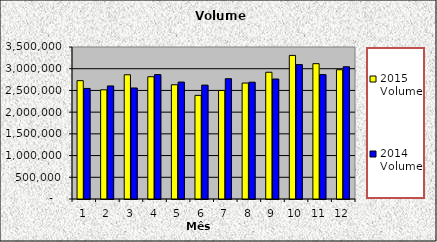
| Category | 2015 Volume | 2014 Volume |
|---|---|---|
| 0 | 2724750 | 2545500 |
| 1 | 2513466.667 | 2602850 |
| 2 | 2860383.333 | 2556116.667 |
| 3 | 2815050 | 2863850 |
| 4 | 2630416.667 | 2692600 |
| 5 | 2386266.667 | 2622166.667 |
| 6 | 2499100 | 2769384 |
| 7 | 2669921 | 2689733.333 |
| 8 | 2918545.8 | 2763139 |
| 9 | 3306499 | 3094300 |
| 10 | 3116101 | 2864083.333 |
| 11 | 2976734 | 3044716.667 |